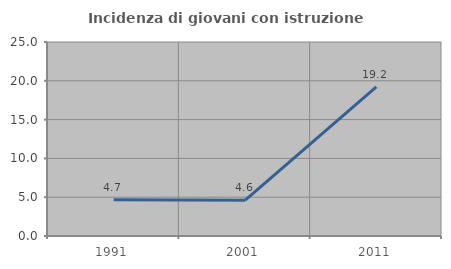
| Category | Incidenza di giovani con istruzione universitaria |
|---|---|
| 1991.0 | 4.667 |
| 2001.0 | 4.598 |
| 2011.0 | 19.217 |